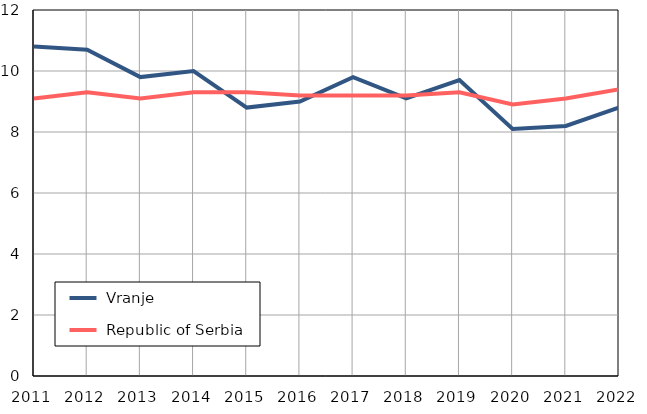
| Category |  Vranje |  Republic of Serbia |
|---|---|---|
| 2011.0 | 10.8 | 9.1 |
| 2012.0 | 10.7 | 9.3 |
| 2013.0 | 9.8 | 9.1 |
| 2014.0 | 10 | 9.3 |
| 2015.0 | 8.8 | 9.3 |
| 2016.0 | 9 | 9.2 |
| 2017.0 | 9.8 | 9.2 |
| 2018.0 | 9.1 | 9.2 |
| 2019.0 | 9.7 | 9.3 |
| 2020.0 | 8.1 | 8.9 |
| 2021.0 | 8.2 | 9.1 |
| 2022.0 | 8.8 | 9.4 |